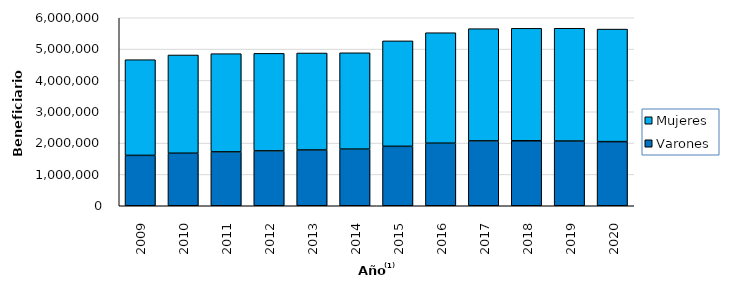
| Category | Varones | Mujeres |
|---|---|---|
| 2009.0 | 1608093 | 3053553 |
| 2010.0 | 1676437 | 3135528 |
| 2011.0 | 1719085 | 3135345 |
| 2012.0 | 1751268 | 3112657 |
| 2013.0 | 1780170 | 3095022 |
| 2014.0 | 1807154 | 3074924 |
| 2015.0 | 1896819 | 3365514 |
| 2016.0 | 1996921 | 3525765 |
| 2017.0 | 2069873 | 3581816 |
| 2018.0 | 2073619 | 3589778 |
| 2019.0 | 2064637 | 3600519 |
| 2020.0 | 2046220 | 3592115 |